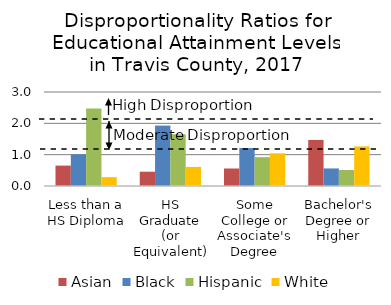
| Category | Asian | Black | Hispanic | White |
|---|---|---|---|---|
| Less than a HS Diploma | 0.651 | 1.012 | 2.473 | 0.283 |
| HS Graduate (or Equivalent) | 0.456 | 1.928 | 1.652 | 0.608 |
| Some College or Associate's Degree | 0.559 | 1.211 | 0.92 | 1.043 |
| Bachelor's Degree or Higher | 1.471 | 0.561 | 0.51 | 1.264 |